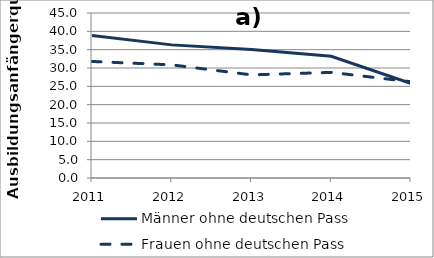
| Category | Männer ohne deutschen Pass | Frauen ohne deutschen Pass |
|---|---|---|
| 2011.0 | 38.839 | 31.784 |
| 2012.0 | 36.306 | 30.855 |
| 2013.0 | 35.061 | 28.123 |
| 2014.0 | 33.192 | 28.805 |
| 2015.0 | 25.794 | 26.241 |